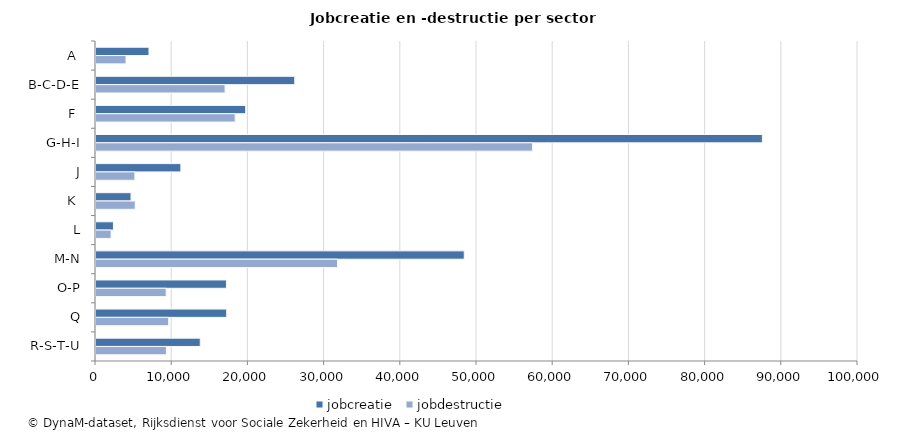
| Category | jobcreatie | jobdestructie |
|---|---|---|
| A  | 6952 | 3937 |
| B-C-D-E | 26086 | 16939 |
| F  | 19645 | 18266 |
| G-H-I | 87449 | 57297 |
| J | 11137 | 5102 |
| K  | 4597 | 5146 |
| L | 2287 | 1975 |
| M-N | 48330 | 31700 |
| O-P | 17119 | 9209 |
| Q | 17154 | 9538 |
| R-S-T-U | 13682 | 9235 |